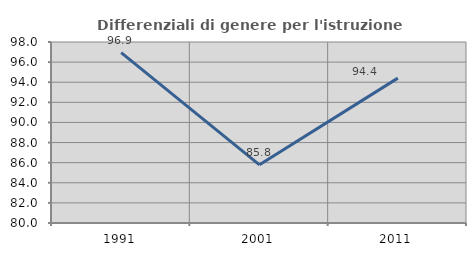
| Category | Differenziali di genere per l'istruzione superiore |
|---|---|
| 1991.0 | 96.943 |
| 2001.0 | 85.784 |
| 2011.0 | 94.408 |